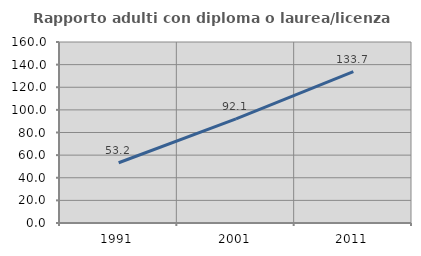
| Category | Rapporto adulti con diploma o laurea/licenza media  |
|---|---|
| 1991.0 | 53.245 |
| 2001.0 | 92.084 |
| 2011.0 | 133.735 |